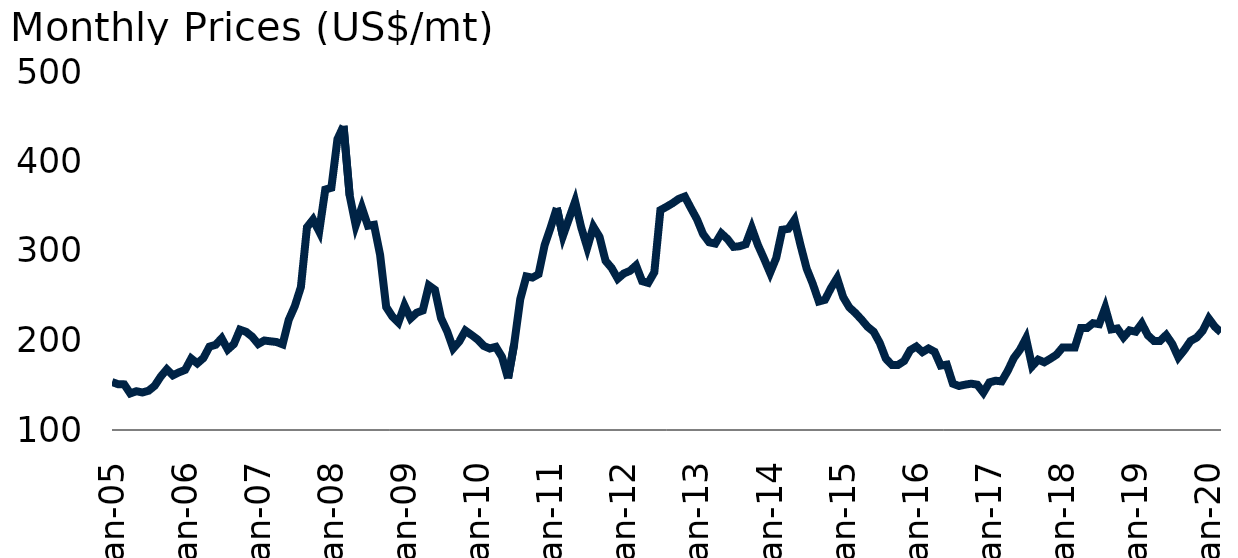
| Category | Wheat |
|---|---|
| 2005-01-01 | 153.593 |
| 2005-02-01 | 151.169 |
| 2005-03-01 | 150.986 |
| 2005-04-01 | 140.877 |
| 2005-05-01 | 143.33 |
| 2005-06-01 | 141.931 |
| 2005-07-01 | 143.87 |
| 2005-08-01 | 149.359 |
| 2005-09-01 | 159.709 |
| 2005-10-01 | 167.827 |
| 2005-11-01 | 161.116 |
| 2005-12-01 | 164.441 |
| 2006-01-01 | 167.161 |
| 2006-02-01 | 179.841 |
| 2006-03-01 | 174.436 |
| 2006-04-01 | 180.346 |
| 2006-05-01 | 193.167 |
| 2006-06-01 | 195.164 |
| 2006-07-01 | 202.429 |
| 2006-08-01 | 189.915 |
| 2006-09-01 | 195.982 |
| 2006-10-01 | 212.094 |
| 2006-11-01 | 209.681 |
| 2006-12-01 | 204.306 |
| 2007-01-01 | 196.066 |
| 2007-02-01 | 199.982 |
| 2007-03-01 | 199.098 |
| 2007-04-01 | 198.308 |
| 2007-05-01 | 195.721 |
| 2007-06-01 | 223.039 |
| 2007-07-01 | 238.407 |
| 2007-08-01 | 259.727 |
| 2007-09-01 | 326.545 |
| 2007-10-01 | 335.146 |
| 2007-11-01 | 321.813 |
| 2007-12-01 | 368.62 |
| 2008-01-01 | 370.661 |
| 2008-02-01 | 424.996 |
| 2008-03-01 | 439.716 |
| 2008-04-01 | 362.229 |
| 2008-05-01 | 328.762 |
| 2008-06-01 | 348.553 |
| 2008-07-01 | 328.184 |
| 2008-08-01 | 329.344 |
| 2008-09-01 | 295.55 |
| 2008-10-01 | 237.384 |
| 2008-11-01 | 226.846 |
| 2008-12-01 | 220.135 |
| 2009-01-01 | 239.114 |
| 2009-02-01 | 224.688 |
| 2009-03-01 | 230.982 |
| 2009-04-01 | 233.473 |
| 2009-05-01 | 261.482 |
| 2009-06-01 | 256.645 |
| 2009-07-01 | 224.85 |
| 2009-08-01 | 210.373 |
| 2009-09-01 | 191.093 |
| 2009-10-01 | 198.849 |
| 2009-11-01 | 211.038 |
| 2009-12-01 | 206.251 |
| 2010-01-01 | 201.191 |
| 2010-02-01 | 194 |
| 2010-03-01 | 191.075 |
| 2010-04-01 | 192.87 |
| 2010-05-01 | 181.606 |
| 2010-06-01 | 157.672 |
| 2010-07-01 | 195.818 |
| 2010-08-01 | 246.247 |
| 2010-09-01 | 271.674 |
| 2010-10-01 | 270.232 |
| 2010-11-01 | 274.081 |
| 2010-12-01 | 306.52 |
| 2011-01-01 | 326.557 |
| 2011-02-01 | 348.12 |
| 2011-03-01 | 316.747 |
| 2011-04-01 | 336.124 |
| 2011-05-01 | 355.278 |
| 2011-06-01 | 326.43 |
| 2011-07-01 | 303.884 |
| 2011-08-01 | 327.067 |
| 2011-09-01 | 315.916 |
| 2011-10-01 | 289.011 |
| 2011-11-01 | 281.006 |
| 2011-12-01 | 269.03 |
| 2012-01-01 | 274.893 |
| 2012-02-01 | 277.773 |
| 2012-03-01 | 283.878 |
| 2012-04-01 | 266.324 |
| 2012-05-01 | 264.359 |
| 2012-06-01 | 276.19 |
| 2012-07-01 | 345.688 |
| 2012-08-01 | 349.4 |
| 2012-09-01 | 353.421 |
| 2012-10-01 | 358.196 |
| 2012-11-01 | 360.823 |
| 2012-12-01 | 347.963 |
| 2013-01-01 | 335.47 |
| 2013-02-01 | 318.935 |
| 2013-03-01 | 309.749 |
| 2013-04-01 | 308.279 |
| 2013-05-01 | 319.67 |
| 2013-06-01 | 313.424 |
| 2013-07-01 | 304.605 |
| 2013-08-01 | 305.34 |
| 2013-09-01 | 307.508 |
| 2013-10-01 | 325.687 |
| 2013-11-01 | 306.752 |
| 2013-12-01 | 291.557 |
| 2014-01-01 | 275.578 |
| 2014-02-01 | 292.112 |
| 2014-03-01 | 323.712 |
| 2014-04-01 | 324.814 |
| 2014-05-01 | 334.735 |
| 2014-06-01 | 306.442 |
| 2014-07-01 | 280.354 |
| 2014-08-01 | 263.452 |
| 2014-09-01 | 243.611 |
| 2014-10-01 | 245.448 |
| 2014-11-01 | 258.675 |
| 2014-12-01 | 269.699 |
| 2015-01-01 | 248.387 |
| 2015-02-01 | 236.997 |
| 2015-03-01 | 230.75 |
| 2015-04-01 | 223.402 |
| 2015-05-01 | 215.318 |
| 2015-06-01 | 209.806 |
| 2015-07-01 | 197.314 |
| 2015-08-01 | 179.677 |
| 2015-09-01 | 172.695 |
| 2015-10-01 | 172.71 |
| 2015-11-01 | 177.104 |
| 2015-12-01 | 189.23 |
| 2016-01-01 | 193.272 |
| 2016-02-01 | 187.025 |
| 2016-03-01 | 191.067 |
| 2016-04-01 | 187.393 |
| 2016-05-01 | 171.96 |
| 2016-06-01 | 173.063 |
| 2016-07-01 | 151.751 |
| 2016-08-01 | 149.179 |
| 2016-09-01 | 150.649 |
| 2016-10-01 | 151.751 |
| 2016-11-01 | 150.649 |
| 2016-12-01 | 141.831 |
| 2017-01-01 | 153.221 |
| 2017-02-01 | 155.058 |
| 2017-03-01 | 154.323 |
| 2017-04-01 | 166.081 |
| 2017-05-01 | 180.411 |
| 2017-06-01 | 189.597 |
| 2017-07-01 | 202.458 |
| 2017-08-01 | 171.226 |
| 2017-09-01 | 178.574 |
| 2017-10-01 | 175.635 |
| 2017-11-01 | 179.677 |
| 2017-12-01 | 184.086 |
| 2018-01-01 | 192.169 |
| 2018-02-01 | 192.169 |
| 2018-03-01 | 192.169 |
| 2018-04-01 | 213.848 |
| 2018-05-01 | 213.848 |
| 2018-06-01 | 219.36 |
| 2018-07-01 | 218.257 |
| 2018-08-01 | 236.629 |
| 2018-09-01 | 212.378 |
| 2018-10-01 | 213.481 |
| 2018-11-01 | 203.56 |
| 2018-12-01 | 211.276 |
| 2019-01-01 | 209.806 |
| 2019-02-01 | 218.992 |
| 2019-03-01 | 205.765 |
| 2019-04-01 | 199.518 |
| 2019-05-01 | 199.518 |
| 2019-06-01 | 206.132 |
| 2019-07-01 | 196.211 |
| 2019-08-01 | 181.146 |
| 2019-09-01 | 189.597 |
| 2019-10-01 | 199.518 |
| 2019-11-01 | 203.192 |
| 2019-12-01 | 210.909 |
| 2020-01-01 | 224.504 |
| 2020-02-01 | 215.318 |
| 2020-03-01 | 209.071 |